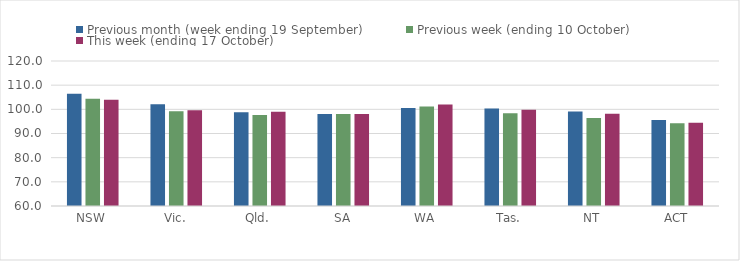
| Category | Previous month (week ending 19 September) | Previous week (ending 10 October) | This week (ending 17 October) |
|---|---|---|---|
| NSW | 106.5 | 104.41 | 103.97 |
| Vic. | 102.09 | 99.23 | 99.61 |
| Qld. | 98.79 | 97.62 | 99.02 |
| SA | 98.08 | 98.02 | 98.02 |
| WA | 100.54 | 101.17 | 102.01 |
| Tas. | 100.36 | 98.37 | 99.79 |
| NT | 99.07 | 96.39 | 98.22 |
| ACT | 95.57 | 94.2 | 94.47 |